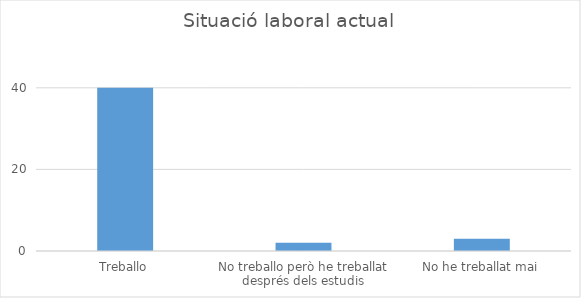
| Category | Series 0 |
|---|---|
| Treballo | 40 |
| No treballo però he treballat després dels estudis | 2 |
| No he treballat mai | 3 |